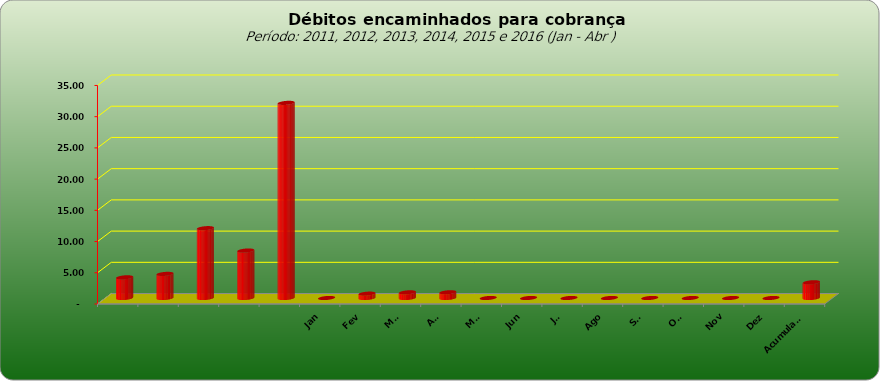
| Category |  3.309.443,02  |
|---|---|
|  | 3309443.02 |
|  | 3859728.44 |
|  | 11181928.25 |
|  | 7600526.01 |
|  | 31248623.5 |
| Jan | 0 |
| Fev | 695716.82 |
| Mar | 906394.22 |
| Abr | 915013.51 |
| Mai | 0 |
| Jun | 0 |
| Jul | 0 |
| Ago | 0 |
| Set | 0 |
| Out | 0 |
| Nov | 0 |
| Dez | 0 |
| Acumulado | 2517124.55 |